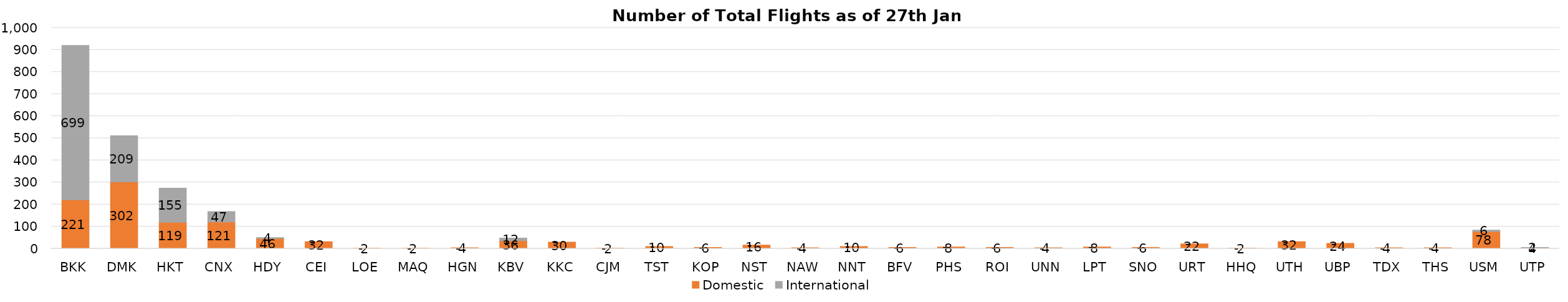
| Category | Domestic | International |
|---|---|---|
| BKK | 221 | 699 |
| DMK | 302 | 209 |
| HKT | 119 | 155 |
| CNX | 121 | 47 |
| HDY | 46 | 4 |
| CEI | 32 | 0 |
| LOE | 2 | 0 |
| MAQ | 2 | 0 |
| HGN | 4 | 0 |
| KBV | 36 | 12 |
| KKC | 30 | 0 |
| CJM | 2 | 0 |
| TST | 10 | 0 |
| KOP | 6 | 0 |
| NST | 16 | 0 |
| NAW | 4 | 0 |
| NNT | 10 | 0 |
| BFV | 6 | 0 |
| PHS | 8 | 0 |
| ROI | 6 | 0 |
| UNN | 4 | 0 |
| LPT | 8 | 0 |
| SNO | 6 | 0 |
| URT | 22 | 0 |
| HHQ | 2 | 0 |
| UTH | 32 | 0 |
| UBP | 24 | 0 |
| TDX | 4 | 0 |
| THS | 4 | 0 |
| USM | 78 | 6 |
| UTP | 4 | 2 |